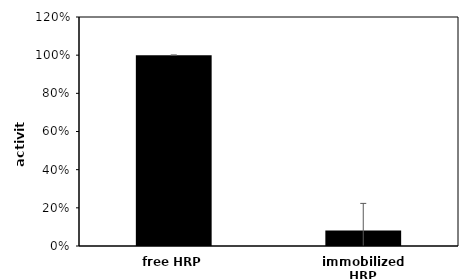
| Category | Series 0 |
|---|---|
| free HRP | 1 |
| immobilized HRP | 0.082 |